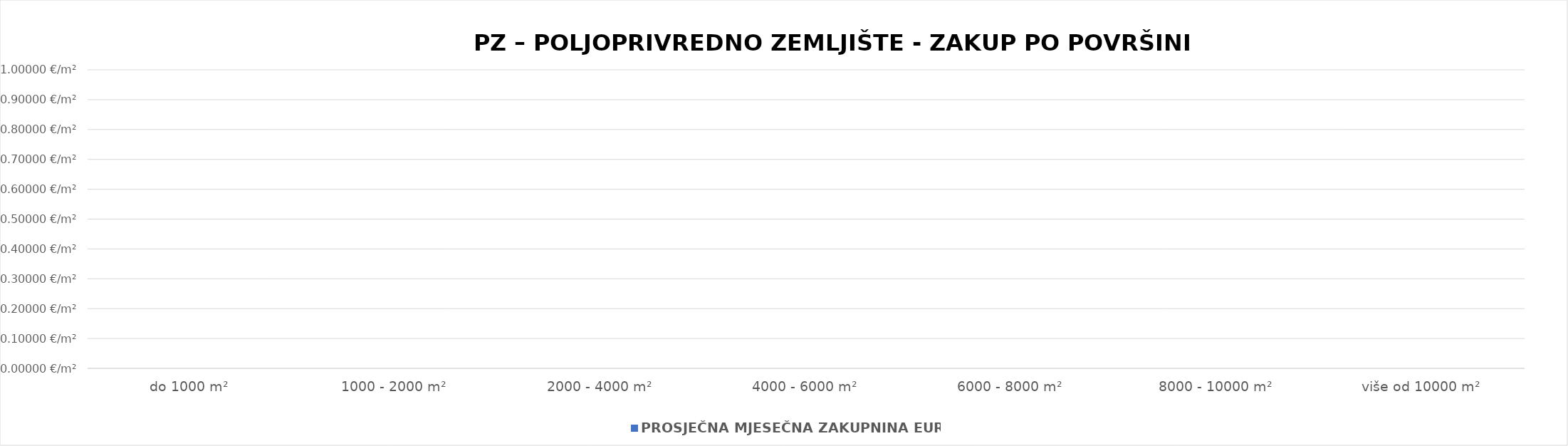
| Category | PROSJEČNA MJESEČNA ZAKUPNINA EUR/m2 |
|---|---|
| do 1000 m² | 0 |
| 1000 - 2000 m² | 0 |
| 2000 - 4000 m² | 0 |
| 4000 - 6000 m² | 0 |
| 6000 - 8000 m² | 0 |
| 8000 - 10000 m² | 0 |
| više od 10000 m² | 0 |